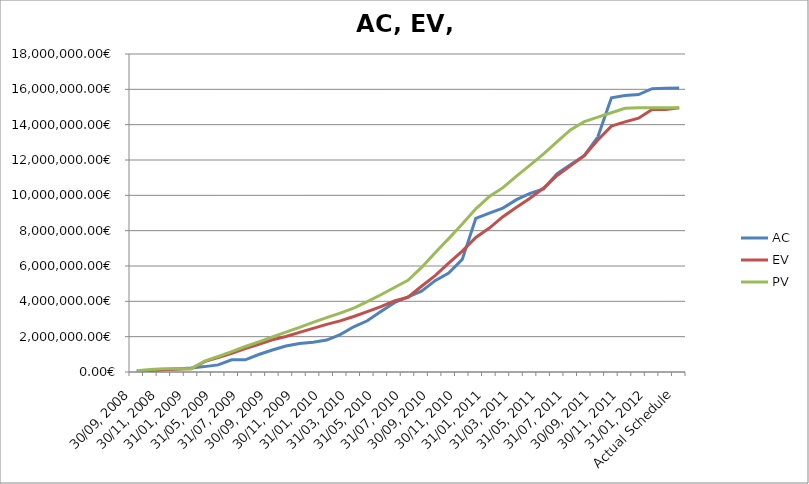
| Category | AC | EV | PV |
|---|---|---|---|
| 30/09, 2008 | 21040 | 55759.035 | 67840.157 |
| 31/10, 2008 | 85856.852 | 74007.445 | 138378.502 |
| 30/11, 2008 | 120985.98 | 136661.475 | 185018.609 |
| 31/12, 2008 | 173497.359 | 168027.102 | 185018.609 |
| 31/01, 2009 | 228795.609 | 185018.609 | 185018.609 |
| 30/04, 2009 | 304874.609 | 583834.614 | 611161.831 |
| 31/05, 2009 | 402230.109 | 812376.69 | 876911.663 |
| 30/06, 2009 | 686985.109 | 1062931.186 | 1152096.401 |
| 31/07, 2009 | 686985.109 | 1328615.248 | 1441433.496 |
| 31/08, 2009 | 991534.609 | 1571196.328 | 1705610.844 |
| 30/09, 2009 | 1243936.109 | 1825328.945 | 1982368.065 |
| 31/10, 2009 | 1468075.609 | 2010068.052 | 2260697.771 |
| 30/11, 2009 | 1613780.109 | 2243763.384 | 2523302.634 |
| 31/12, 2009 | 1686239.609 | 2469012.362 | 2812639.73 |
| 31/01, 2010 | 1807855.109 | 2698504.617 | 3078389.562 |
| 28/02, 2010 | 2116364.109 | 2892718.619 | 3329987.036 |
| 31/03, 2010 | 2559687.609 | 3141827.046 | 3617751.647 |
| 30/04, 2010 | 2899625.922 | 3420065.821 | 3983339.119 |
| 31/05, 2010 | 3419244.422 | 3700793.913 | 4372923.878 |
| 30/06, 2010 | 3922660.172 | 4019342.634 | 4781060.293 |
| 31/07, 2010 | 4257200.172 | 4230096.227 | 5191515.665 |
| 31/08, 2010 | 4573279.984 | 4853930.679 | 5920757.471 |
| 30/09, 2010 | 5171155.609 | 5459046.522 | 6750543.405 |
| 31/10, 2010 | 5599948.422 | 6167425.068 | 7547326.49 |
| 30/11, 2010 | 6372564.422 | 6846184.382 | 8372397.732 |
| 31/12, 2010 | 8698517.453 | 7618694.021 | 9239901.209 |
| 31/01, 2011 | 8993259.953 | 8146977.038 | 9932903.096 |
| 28/02, 2011 | 9277757.891 | 8790589.845 | 10435656.471 |
| 31/03, 2011 | 9753794.57 | 9324578.734 | 11091135.793 |
| 30/04, 2011 | 10115268.133 | 9835544.459 | 11708698.098 |
| 31/05, 2011 | 10365846.891 | 10414331.844 | 12348185.692 |
| 30/06, 2011 | 11224846.484 | 11125759.681 | 13034549.195 |
| 31/07, 2011 | 11751144.422 | 11680692.169 | 13716016.384 |
| 31/08, 2011 | 12242780.922 | 12251828.365 | 14168309.157 |
| 30/09, 2011 | 13311177.785 | 13128630.499 | 14426919.456 |
| 31/10, 2011 | 15522444.009 | 13915729.073 | 14673286.009 |
| 30/11, 2011 | 15645518.649 | 14155658.498 | 14931384.301 |
| 31/12, 2011 | 15706710.673 | 14366992.84 | 14956314.25 |
| 31/01, 2012 | 16036916.27 | 14855303.397 | 14956314.25 |
| 29/02, 2012 | 16058066.35 | 14855303.397 | 14956314.25 |
| Actual Schedule | 16068878.299 | 14956314.25 | 14956314.25 |